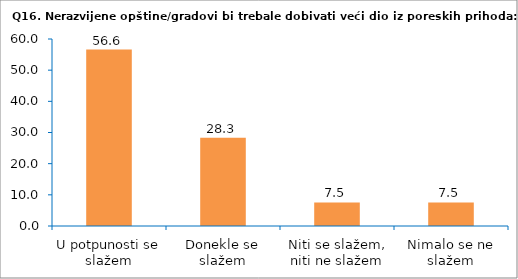
| Category | Series 0 |
|---|---|
| U potpunosti se slažem | 56.604 |
| Donekle se slažem | 28.302 |
| Niti se slažem, niti ne slažem | 7.547 |
| Nimalo se ne slažem | 7.547 |